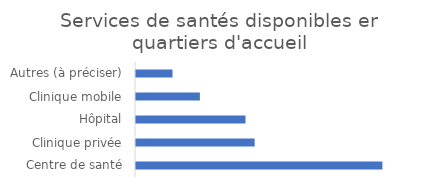
| Category | Fréquence |
|---|---|
| Centre de santé | 0.338 |
| Clinique privée | 0.162 |
| Hôpital | 0.15 |
| Clinique mobile | 0.088 |
| Autres (à préciser) | 0.05 |